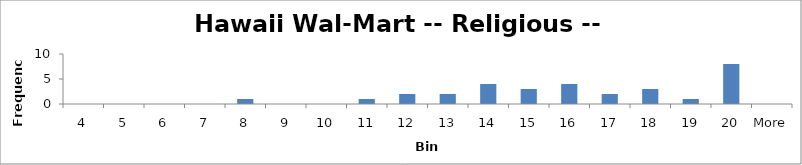
| Category | Frequency |
|---|---|
| 4 | 0 |
| 5 | 0 |
| 6 | 0 |
| 7 | 0 |
| 8 | 1 |
| 9 | 0 |
| 10 | 0 |
| 11 | 1 |
| 12 | 2 |
| 13 | 2 |
| 14 | 4 |
| 15 | 3 |
| 16 | 4 |
| 17 | 2 |
| 18 | 3 |
| 19 | 1 |
| 20 | 8 |
| More | 0 |